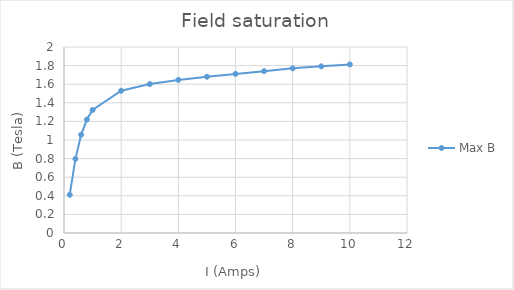
| Category | Max B |
|---|---|
| 0.2 | 0.411 |
| 0.4 | 0.797 |
| 0.6 | 1.056 |
| 0.8 | 1.22 |
| 1.0 | 1.323 |
| 2.0 | 1.53 |
| 3.0 | 1.601 |
| 4.0 | 1.646 |
| 5.0 | 1.68 |
| 6.0 | 1.711 |
| 7.0 | 1.741 |
| 8.0 | 1.77 |
| 9.0 | 1.792 |
| 10.0 | 1.813 |